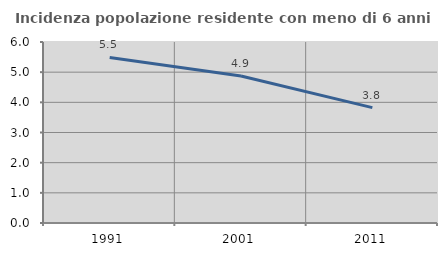
| Category | Incidenza popolazione residente con meno di 6 anni |
|---|---|
| 1991.0 | 5.488 |
| 2001.0 | 4.871 |
| 2011.0 | 3.824 |